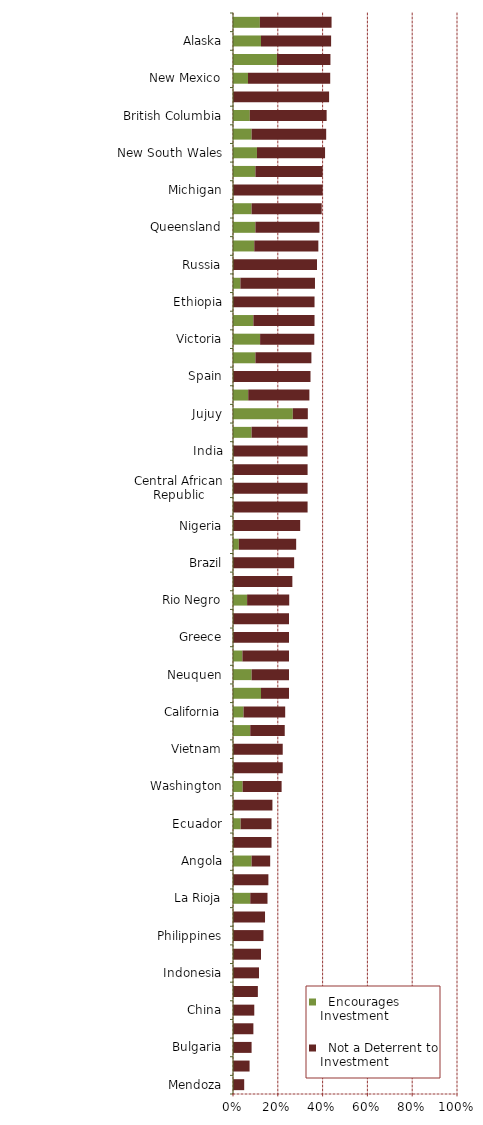
| Category |   Encourages Investment |   Not a Deterrent to Investment |
|---|---|---|
| Mendoza | 0 | 0.05 |
| Venezuela | 0 | 0.074 |
| Bulgaria | 0 | 0.083 |
| South Sudan | 0 | 0.091 |
| China | 0 | 0.095 |
| Chubut | 0 | 0.111 |
| Indonesia | 0 | 0.116 |
| Romania | 0 | 0.125 |
| Philippines | 0 | 0.136 |
| Honduras | 0 | 0.143 |
| La Rioja | 0.077 | 0.077 |
| Mongolia | 0 | 0.158 |
| Angola | 0.083 | 0.083 |
| Zimbabwe | 0 | 0.172 |
| Ecuador | 0.034 | 0.138 |
| Kyrgyzstan | 0 | 0.176 |
| Washington | 0.043 | 0.174 |
| Sudan | 0 | 0.222 |
| Vietnam | 0 | 0.222 |
| Myanmar | 0.077 | 0.154 |
| California | 0.047 | 0.186 |
| Tasmania | 0.125 | 0.125 |
| Neuquen | 0.083 | 0.167 |
| Bolivia | 0.042 | 0.208 |
| Greece | 0 | 0.25 |
| Hungary | 0 | 0.25 |
| Rio Negro | 0.063 | 0.188 |
| Democratic Republic of Congo  (DRC) | 0 | 0.265 |
| Brazil | 0 | 0.273 |
| Montana | 0.026 | 0.256 |
| Nigeria | 0 | 0.3 |
| Malaysia | 0 | 0.333 |
| Central African Republic | 0 | 0.333 |
| Dominican Republic | 0 | 0.333 |
| India | 0 | 0.333 |
| Kazakhstan | 0.083 | 0.25 |
| Jujuy | 0.267 | 0.067 |
| South Africa | 0.068 | 0.273 |
| Spain | 0 | 0.346 |
| Santa Cruz | 0.1 | 0.25 |
| Victoria | 0.121 | 0.242 |
| Solomon Islands | 0.091 | 0.273 |
| Ethiopia | 0 | 0.364 |
| New Zealand | 0.033 | 0.333 |
| Russia | 0 | 0.375 |
| Guinea (Conakry) | 0.095 | 0.286 |
| Queensland | 0.1 | 0.286 |
| Colorado | 0.083 | 0.313 |
| Michigan | 0 | 0.4 |
| Thailand | 0.1 | 0.3 |
| New South Wales | 0.107 | 0.304 |
| Egypt | 0.083 | 0.333 |
| British Columbia | 0.075 | 0.343 |
| France | 0 | 0.429 |
| New Mexico | 0.067 | 0.367 |
| Nunavut | 0.196 | 0.239 |
| Alaska | 0.125 | 0.313 |
| Ivory Coast | 0.12 | 0.32 |